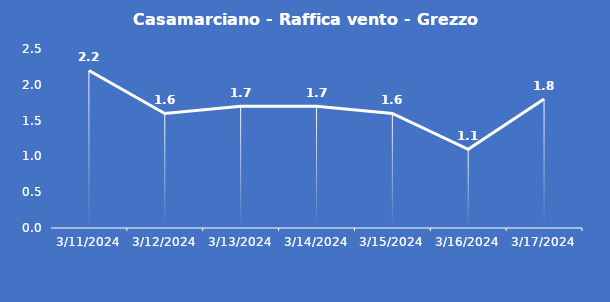
| Category | Casamarciano - Raffica vento - Grezzo (m/s) |
|---|---|
| 3/11/24 | 2.2 |
| 3/12/24 | 1.6 |
| 3/13/24 | 1.7 |
| 3/14/24 | 1.7 |
| 3/15/24 | 1.6 |
| 3/16/24 | 1.1 |
| 3/17/24 | 1.8 |